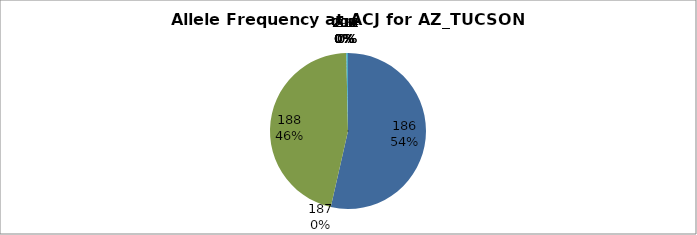
| Category | Series 0 |
|---|---|
| 186.0 | 0.535 |
| 187.0 | 0 |
| 188.0 | 0.461 |
| 190.0 | 0 |
| 202.0 | 0 |
| 204.0 | 0 |
| 206.0 | 0 |
| 207.0 | 0 |
| 208.0 | 0 |
| 209.0 | 0 |
| 210.0 | 0.004 |
| 212.0 | 0 |
| 214.0 | 0 |
| 227.0 | 0 |